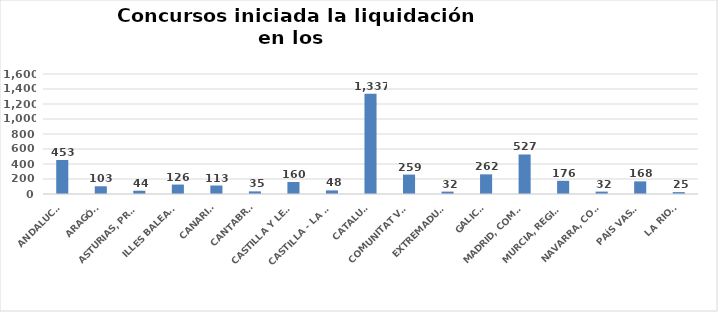
| Category | Series 0 |
|---|---|
| ANDALUCÍA | 453 |
| ARAGÓN | 103 |
| ASTURIAS, PRINCIPADO | 44 |
| ILLES BALEARS | 126 |
| CANARIAS | 113 |
| CANTABRIA | 35 |
| CASTILLA Y LEÓN | 160 |
| CASTILLA - LA MANCHA | 48 |
| CATALUÑA | 1337 |
| COMUNITAT VALENCIANA | 259 |
| EXTREMADURA | 32 |
| GALICIA | 262 |
| MADRID, COMUNIDAD | 527 |
| MURCIA, REGIÓN | 176 |
| NAVARRA, COM. FORAL | 32 |
| PAÍS VASCO | 168 |
| LA RIOJA | 25 |